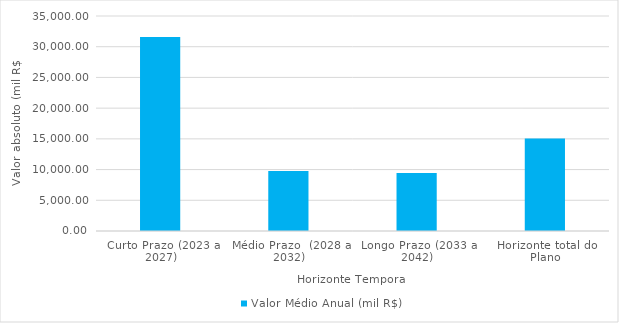
| Category | Valor Médio Anual (mil R$) |
|---|---|
| Curto Prazo (2023 a 2027) | 31590.111 |
| Médio Prazo  (2028 a 2032) | 9779.491 |
| Longo Prazo (2033 a 2042) | 9437.214 |
| Horizonte total do Plano | 15061.008 |